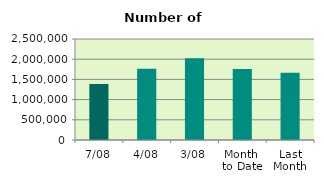
| Category | Series 0 |
|---|---|
| 7/08 | 1388992 |
| 4/08 | 1764150 |
| 3/08 | 2021710 |
| Month 
to Date | 1756762.8 |
| Last
Month | 1667155.905 |